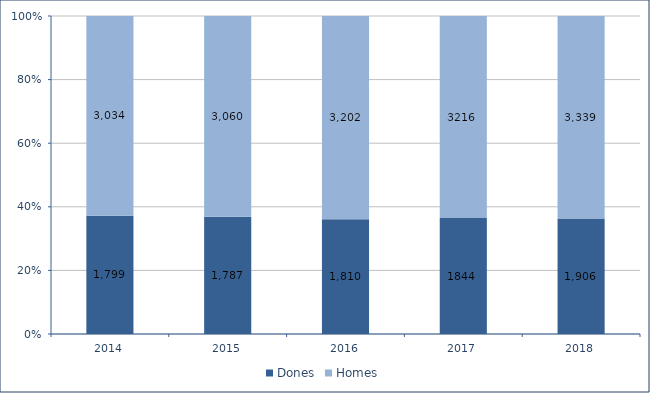
| Category | Dones | Homes |
|---|---|---|
| 2014.0 | 1799 | 3034 |
| 2015.0 | 1787 | 3060 |
| 2016.0 | 1810 | 3202 |
| 2017.0 | 1844 | 3216 |
| 2018.0 | 1906 | 3339 |